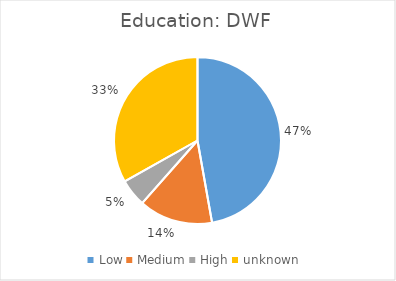
| Category | Education |
|---|---|
| Low | 0.472 |
| Medium | 0.143 |
| High | 0.053 |
| unknown | 0.332 |